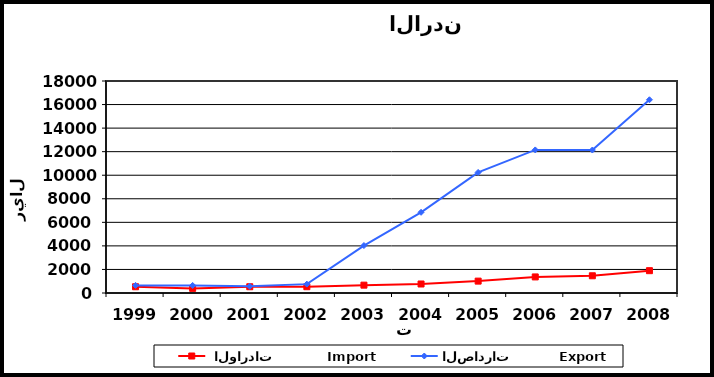
| Category |  الواردات           Import | الصادرات          Export |
|---|---|---|
| 1999.0 | 530 | 647 |
| 2000.0 | 392 | 642 |
| 2001.0 | 531 | 569 |
| 2002.0 | 534 | 753 |
| 2003.0 | 667 | 4029 |
| 2004.0 | 765 | 6852 |
| 2005.0 | 1009 | 10238 |
| 2006.0 | 1365 | 12148 |
| 2007.0 | 1463 | 12139 |
| 2008.0 | 1895 | 16406 |